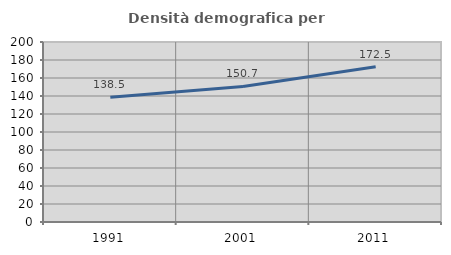
| Category | Densità demografica |
|---|---|
| 1991.0 | 138.479 |
| 2001.0 | 150.65 |
| 2011.0 | 172.538 |